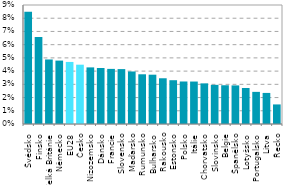
| Category | Series 0 |
|---|---|
| Švédsko | 0.085 |
| Finsko | 0.066 |
| Velká Británie | 0.049 |
| Německo | 0.048 |
| EU28 | 0.047 |
| Česko | 0.045 |
| Nizozemsko | 0.043 |
| Dánsko | 0.042 |
| Francie | 0.042 |
| Slovensko | 0.042 |
| Maďarsko | 0.04 |
| Rumunsko | 0.038 |
| Bulharsko | 0.037 |
| Rakousko | 0.035 |
| Estonsko | 0.033 |
| Polsko | 0.032 |
| Itálie | 0.032 |
| Chorvatsko | 0.031 |
| Slovinsko | 0.03 |
| Belgie | 0.029 |
| Španělsko | 0.029 |
| Lotyšsko | 0.027 |
| Portugalsko | 0.024 |
| Litva | 0.024 |
| Řecko | 0.015 |